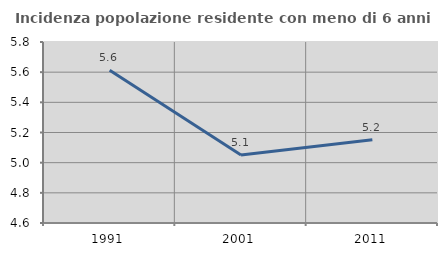
| Category | Incidenza popolazione residente con meno di 6 anni |
|---|---|
| 1991.0 | 5.612 |
| 2001.0 | 5.051 |
| 2011.0 | 5.152 |